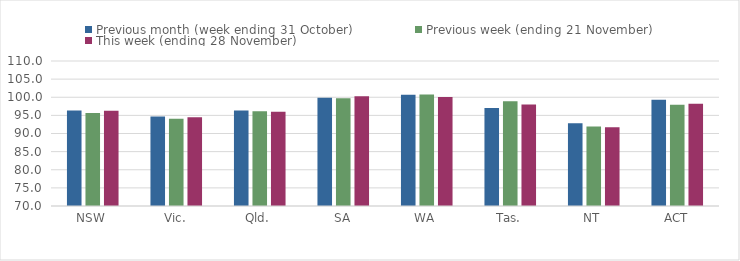
| Category | Previous month (week ending 31 October) | Previous week (ending 21 November) | This week (ending 28 November) |
|---|---|---|---|
| NSW | 96.36 | 95.66 | 96.25 |
| Vic. | 94.66 | 94.05 | 94.47 |
| Qld. | 96.33 | 96.16 | 96.01 |
| SA | 99.85 | 99.74 | 100.27 |
| WA | 100.7 | 100.74 | 100.1 |
| Tas. | 97.01 | 98.89 | 98.03 |
| NT | 92.84 | 91.95 | 91.74 |
| ACT | 99.3 | 97.94 | 98.18 |